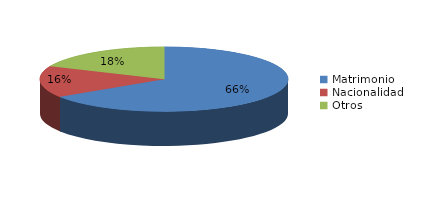
| Category | Series 0 |
|---|---|
| Matrimonio | 850 |
| Nacionalidad | 204 |
| Otros | 238 |